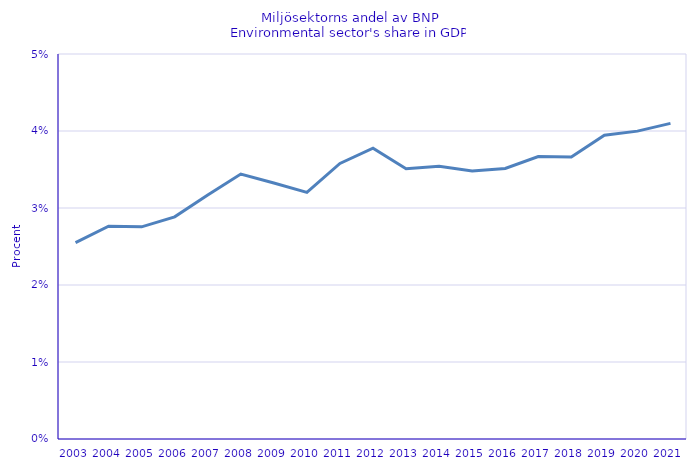
| Category | Miljösektorns andel av BNP
Environmental sector's share in GDP |
|---|---|
| 2003 | 0.025 |
| 2004 | 0.028 |
| 2005 | 0.028 |
| 2006 | 0.029 |
| 2007 | 0.032 |
| 2008 | 0.034 |
| 2009 | 0.033 |
| 2010 | 0.032 |
| 2011 | 0.036 |
| 2012 | 0.038 |
| 2013 | 0.035 |
| 2014 | 0.035 |
| 2015 | 0.035 |
| 2016 | 0.035 |
| 2017 | 0.037 |
| 2018 | 0.037 |
| 2019 | 0.039 |
| 2020 | 0.04 |
| 2021 | 0.041 |